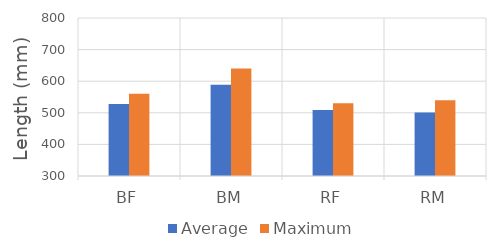
| Category | Average | Maximum |
|---|---|---|
| BF | 527.857 | 560 |
| BM | 588.75 | 640 |
| RF | 508.75 | 530 |
| RM | 501 | 540 |